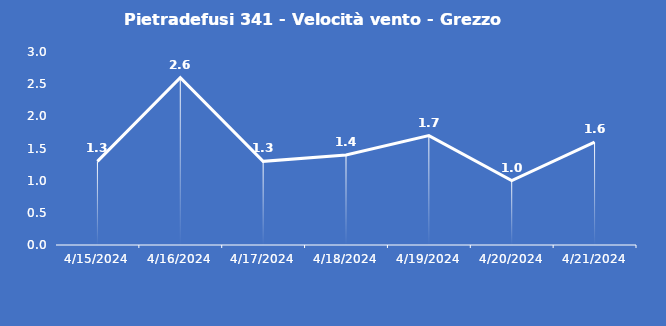
| Category | Pietradefusi 341 - Velocità vento - Grezzo (m/s) |
|---|---|
| 4/15/24 | 1.3 |
| 4/16/24 | 2.6 |
| 4/17/24 | 1.3 |
| 4/18/24 | 1.4 |
| 4/19/24 | 1.7 |
| 4/20/24 | 1 |
| 4/21/24 | 1.6 |